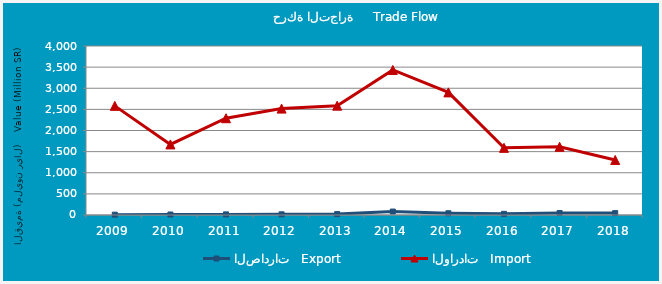
| Category | الصادرات   Export | الواردات   Import |
|---|---|---|
| 2009.0 | 7868822 | 2583009159 |
| 2010.0 | 11663224 | 1670722591 |
| 2011.0 | 14678345 | 2290555848 |
| 2012.0 | 16606425 | 2518471245 |
| 2013.0 | 21837565 | 2587918243 |
| 2014.0 | 81572230 | 3433044603 |
| 2015.0 | 41667612 | 2902176248 |
| 2016.0 | 27690195 | 1589848441 |
| 2017.0 | 47974067 | 1613732661 |
| 2018.0 | 44654325 | 1302164609 |